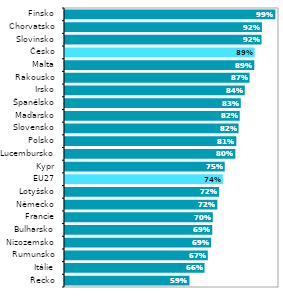
| Category | Series 0 |
|---|---|
| Řecko | 0.586 |
| Itálie | 0.657 |
| Rumunsko | 0.672 |
| Nizozemsko | 0.687 |
| Bulharsko | 0.693 |
| Francie | 0.695 |
| Německo | 0.717 |
| Lotyšsko | 0.725 |
| EU27 | 0.742 |
| Kypr | 0.751 |
| Lucembursko | 0.801 |
| Polsko | 0.805 |
| Slovensko | 0.816 |
| Maďarsko | 0.821 |
| Španělsko | 0.826 |
| Irsko | 0.845 |
| Rakousko | 0.867 |
| Malta | 0.889 |
| Česko | 0.891 |
| Slovinsko | 0.923 |
| Chorvatsko | 0.925 |
| Finsko | 0.988 |